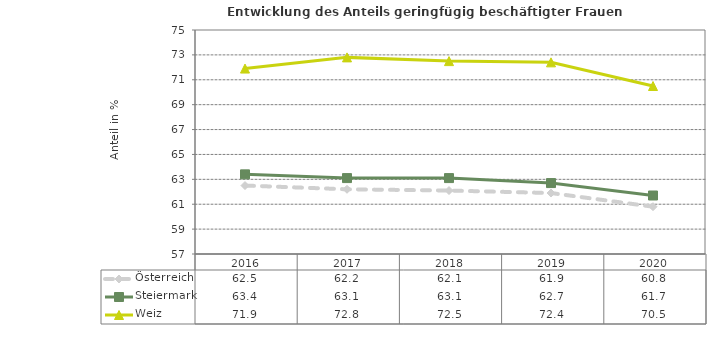
| Category | Österreich | Steiermark | Weiz |
|---|---|---|---|
| 2020.0 | 60.8 | 61.7 | 70.5 |
| 2019.0 | 61.9 | 62.7 | 72.4 |
| 2018.0 | 62.1 | 63.1 | 72.5 |
| 2017.0 | 62.2 | 63.1 | 72.8 |
| 2016.0 | 62.5 | 63.4 | 71.9 |